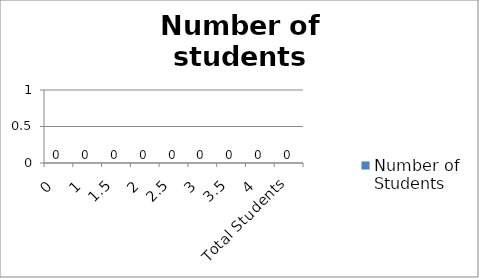
| Category | Number of Students |
|---|---|
| 0 | 0 |
| 1 | 0 |
| 1.5 | 0 |
| 2 | 0 |
| 2.5 | 0 |
| 3 | 0 |
| 3.5 | 0 |
| 4 | 0 |
| Total Students | 0 |